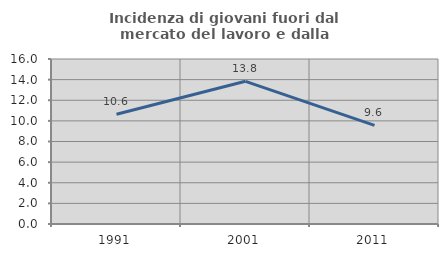
| Category | Incidenza di giovani fuori dal mercato del lavoro e dalla formazione  |
|---|---|
| 1991.0 | 10.644 |
| 2001.0 | 13.836 |
| 2011.0 | 9.568 |